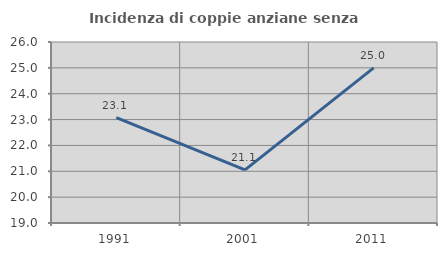
| Category | Incidenza di coppie anziane senza figli  |
|---|---|
| 1991.0 | 23.077 |
| 2001.0 | 21.053 |
| 2011.0 | 25 |